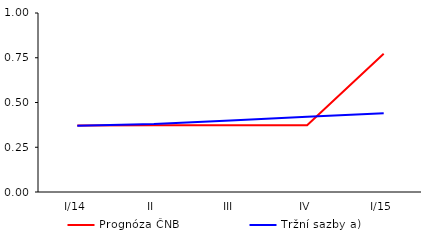
| Category | Prognóza ČNB | Tržní sazby a) |
|---|---|---|
| I/14 | 0.372 | 0.37 |
| II | 0.373 | 0.38 |
| III | 0.373 | 0.4 |
| IV | 0.373 | 0.42 |
| I/15 | 0.772 | 0.44 |